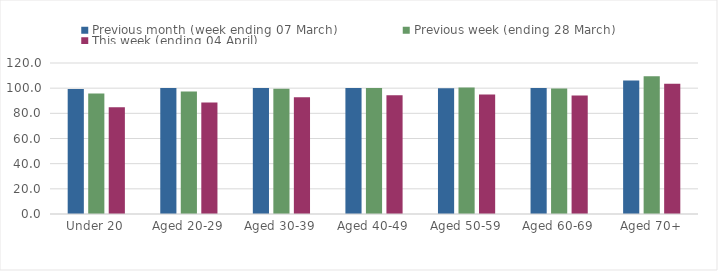
| Category | Previous month (week ending 07 March) | Previous week (ending 28 March) | This week (ending 04 April) |
|---|---|---|---|
| Under 20 | 99.321 | 95.714 | 84.855 |
| Aged 20-29 | 100.148 | 97.349 | 88.597 |
| Aged 30-39 | 100.121 | 99.572 | 92.818 |
| Aged 40-49 | 100.122 | 100.23 | 94.44 |
| Aged 50-59 | 99.954 | 100.459 | 95.032 |
| Aged 60-69 | 100.207 | 99.791 | 94.141 |
| Aged 70+ | 106.18 | 109.422 | 103.502 |